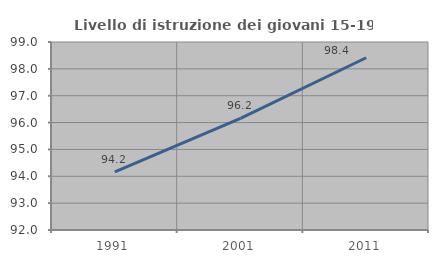
| Category | Livello di istruzione dei giovani 15-19 anni |
|---|---|
| 1991.0 | 94.167 |
| 2001.0 | 96.154 |
| 2011.0 | 98.413 |